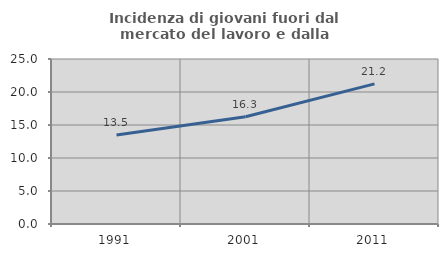
| Category | Incidenza di giovani fuori dal mercato del lavoro e dalla formazione  |
|---|---|
| 1991.0 | 13.475 |
| 2001.0 | 16.259 |
| 2011.0 | 21.226 |